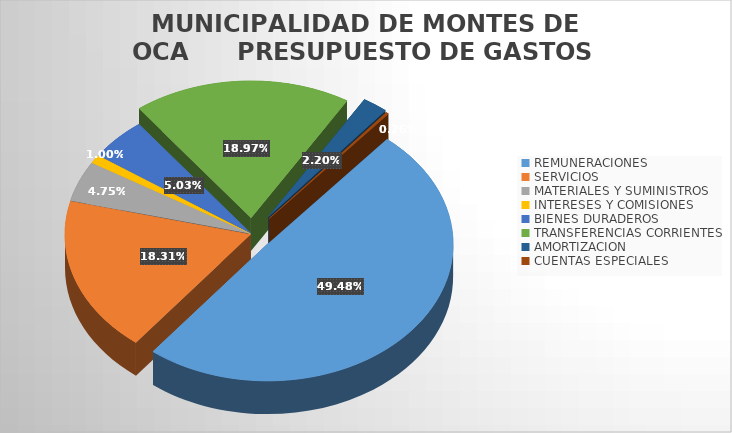
| Category | Series 0 |
|---|---|
| REMUNERACIONES | 2955894267.717 |
| SERVICIOS  | 1094033208.94 |
| MATERIALES Y SUMINISTROS | 283716232.76 |
| INTERESES Y COMISIONES  | 60016210.32 |
| BIENES DURADEROS | 300698749.27 |
| TRANSFERENCIAS CORRIENTES | 1132970194.171 |
| AMORTIZACION  | 131254960.08 |
| CUENTAS ESPECIALES | 15368907.35 |